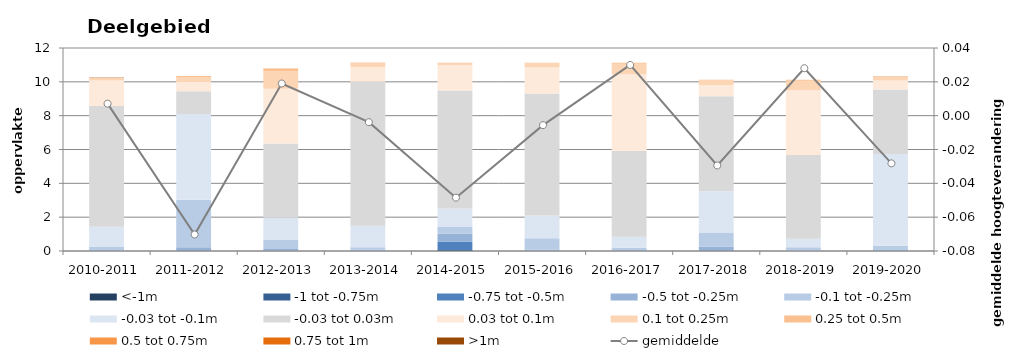
| Category | <-1m | -1 tot -0.75m | -0.75 tot -0.5m | -0.5 tot -0.25m | -0.1 tot -0.25m | -0.03 tot -0.1m | -0.03 tot 0.03m | 0.03 tot 0.1m | 0.1 tot 0.25m | 0.25 tot 0.5m | 0.5 tot 0.75m | 0.75 tot 1m | >1m |
|---|---|---|---|---|---|---|---|---|---|---|---|---|---|
| 2010-2011 | 0 | 0 | 0.003 | 0.038 | 0.203 | 1.195 | 7.129 | 1.509 | 0.126 | 0.032 | 0.011 | 0.003 | 0.001 |
| 2011-2012 | 0 | 0.011 | 0.026 | 0.19 | 2.806 | 5.06 | 1.347 | 0.544 | 0.276 | 0.073 | 0.008 | 0 | 0 |
| 2012-2013 | 0.002 | 0.003 | 0.012 | 0.101 | 0.56 | 1.298 | 4.382 | 3.237 | 1.05 | 0.129 | 0.01 | 0.003 | 0 |
| 2013-2014 | 0 | 0.004 | 0.018 | 0.046 | 0.149 | 1.269 | 8.518 | 0.88 | 0.196 | 0.04 | 0.009 | 0.002 | 0 |
| 2014-2015 | 0.003 | 0.061 | 0.502 | 0.459 | 0.428 | 1.055 | 6.985 | 1.482 | 0.134 | 0.022 | 0.001 | 0 | 0 |
| 2015-2016 | 0 | 0.002 | 0.014 | 0.053 | 0.681 | 1.348 | 7.209 | 1.562 | 0.228 | 0.03 | 0.003 | 0 | 0 |
| 2016-2017 | 0.001 | 0.002 | 0.005 | 0.039 | 0.148 | 0.64 | 5.094 | 4.518 | 0.62 | 0.059 | 0.004 | 0.001 | 0 |
| 2017-2018 | 0.001 | 0.008 | 0.023 | 0.223 | 0.831 | 2.438 | 5.626 | 0.668 | 0.261 | 0.04 | 0.002 | 0 | 0 |
| 2018-2019 | 0 | 0 | 0.002 | 0.029 | 0.188 | 0.508 | 4.941 | 3.842 | 0.556 | 0.052 | 0.004 | 0.001 | 0 |
| 2019-2020 | 0 | 0 | 0.002 | 0.053 | 0.249 | 5.435 | 3.806 | 0.538 | 0.188 | 0.031 | 0.004 | 0.001 | 0.002 |